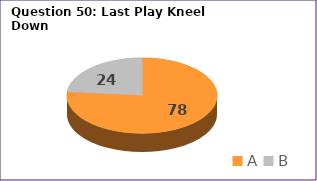
| Category | Series 0 |
|---|---|
| A | 78 |
| B | 24 |